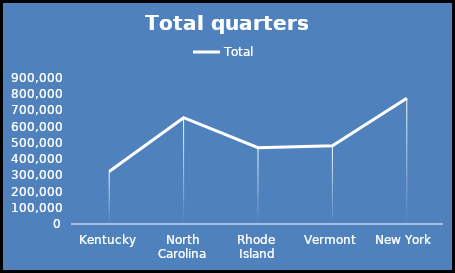
| Category | Total |
|---|---|
| Kentucky | 323564 |
| North Carolina | 655476 |
| Rhode Island | 470100 |
| Vermont | 482804 |
| New York | 775040 |